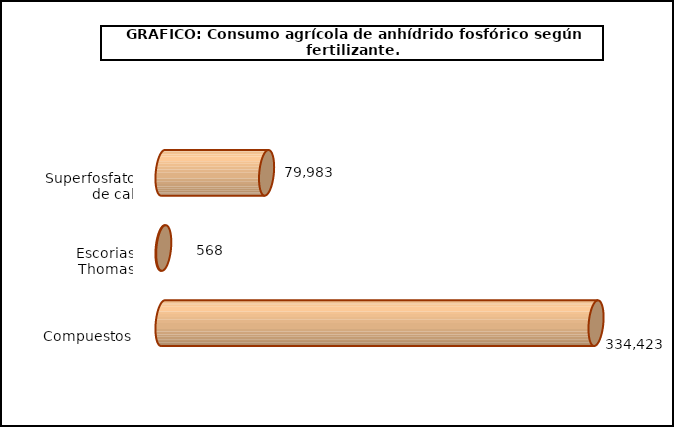
| Category | fert. N |
|---|---|
| 0 | 79983 |
| 1 | 568 |
| 2 | 334423 |